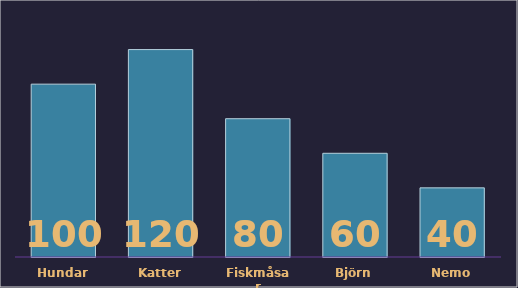
| Category | Series 0 |
|---|---|
| Hundar | 100 |
| Katter | 120 |
| Fiskmåsar | 80 |
| Björn | 60 |
| Nemo | 40 |